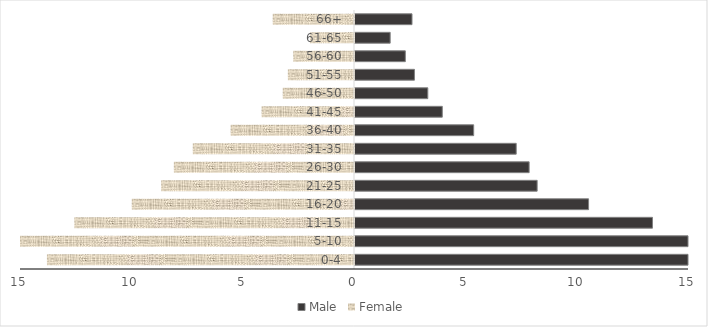
| Category | Male |
|---|---|
| 0-4 | 15.01 |
| 5-10 | 16.32 |
| 11-15 | 13.36 |
| 16-20 | 10.49 |
| 21-25 | 8.18 |
| 26-30 | 7.82 |
| 31-35 | 7.24 |
| 36-40 | 5.33 |
| 41-45 | 3.92 |
| 46-50 | 3.27 |
| 51-55 | 2.67 |
| 56-60 | 2.26 |
| 61-65 | 1.58 |
| 66+ | 2.56 |